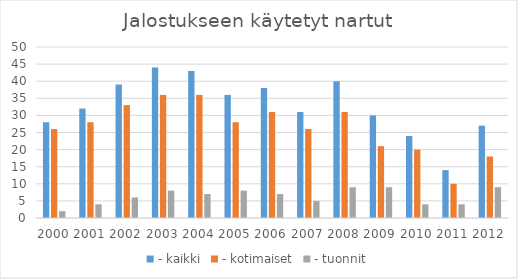
| Category | - kaikki | - kotimaiset | - tuonnit |
|---|---|---|---|
| 2000.0 | 28 | 26 | 2 |
| 2001.0 | 32 | 28 | 4 |
| 2002.0 | 39 | 33 | 6 |
| 2003.0 | 44 | 36 | 8 |
| 2004.0 | 43 | 36 | 7 |
| 2005.0 | 36 | 28 | 8 |
| 2006.0 | 38 | 31 | 7 |
| 2007.0 | 31 | 26 | 5 |
| 2008.0 | 40 | 31 | 9 |
| 2009.0 | 30 | 21 | 9 |
| 2010.0 | 24 | 20 | 4 |
| 2011.0 | 14 | 10 | 4 |
| 2012.0 | 27 | 18 | 9 |